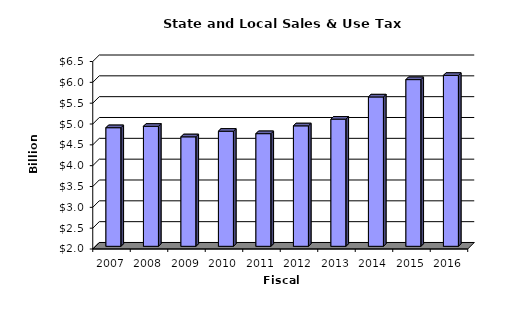
| Category | Series 0 |
|---|---|
| 2007.0 | 4.847 |
| 2008.0 | 4.88 |
| 2009.0 | 4.628 |
| 2010.0 | 4.762 |
| 2011.0 | 4.704 |
| 2012.0 | 4.891 |
| 2013.0 | 5.052 |
| 2014.0 | 5.585 |
| 2015.0 | 6.001 |
| 2016.0 | 6.102 |